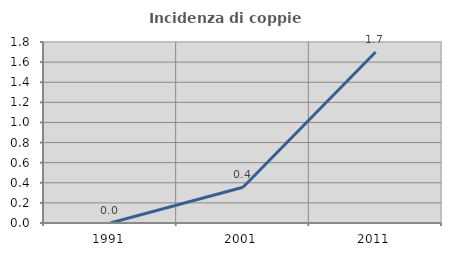
| Category | Incidenza di coppie miste |
|---|---|
| 1991.0 | 0 |
| 2001.0 | 0.356 |
| 2011.0 | 1.701 |